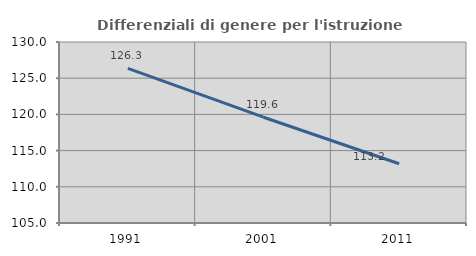
| Category | Differenziali di genere per l'istruzione superiore |
|---|---|
| 1991.0 | 126.349 |
| 2001.0 | 119.612 |
| 2011.0 | 113.184 |